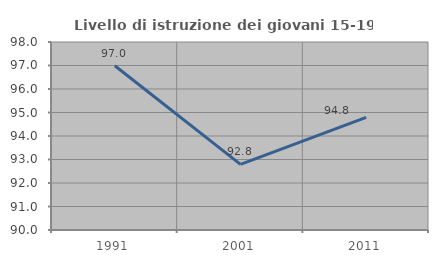
| Category | Livello di istruzione dei giovani 15-19 anni |
|---|---|
| 1991.0 | 96.988 |
| 2001.0 | 92.793 |
| 2011.0 | 94.792 |